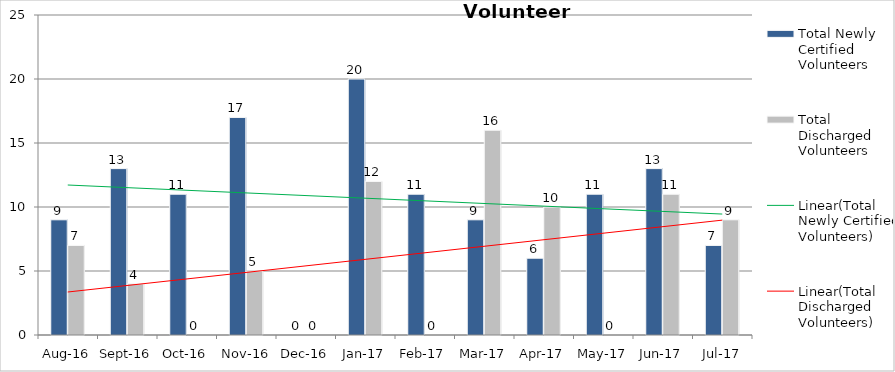
| Category | Total Newly Certified Volunteers | Total Discharged Volunteers |
|---|---|---|
| Aug-16 | 9 | 7 |
| Sep-16 | 13 | 4 |
| Oct-16 | 11 | 0 |
| Nov-16 | 17 | 5 |
| Dec-16 | 0 | 0 |
| Jan-17 | 20 | 12 |
| Feb-17 | 11 | 0 |
| Mar-17 | 9 | 16 |
| Apr-17 | 6 | 10 |
| May-17 | 11 | 0 |
| Jun-17 | 13 | 11 |
| Jul-17 | 7 | 9 |